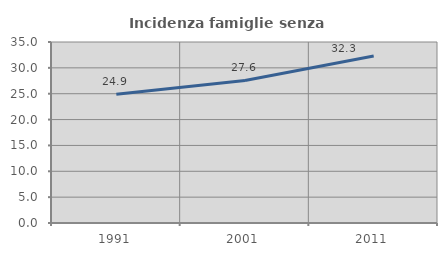
| Category | Incidenza famiglie senza nuclei |
|---|---|
| 1991.0 | 24.887 |
| 2001.0 | 27.56 |
| 2011.0 | 32.305 |